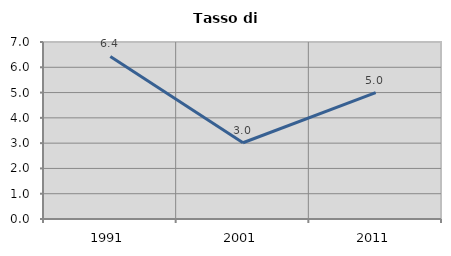
| Category | Tasso di disoccupazione   |
|---|---|
| 1991.0 | 6.428 |
| 2001.0 | 3.015 |
| 2011.0 | 5 |